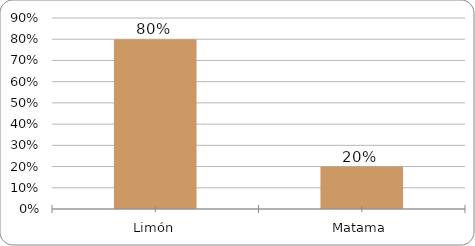
| Category | Series 0 |
|---|---|
| Limón | 0.8 |
| Matama | 0.2 |